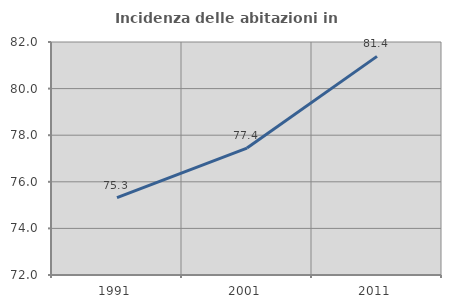
| Category | Incidenza delle abitazioni in proprietà  |
|---|---|
| 1991.0 | 75.322 |
| 2001.0 | 77.448 |
| 2011.0 | 81.383 |